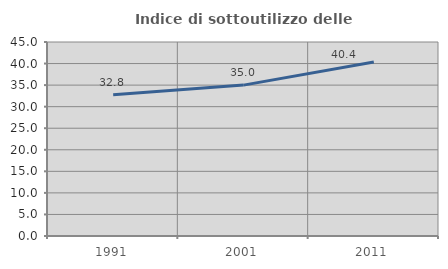
| Category | Indice di sottoutilizzo delle abitazioni  |
|---|---|
| 1991.0 | 32.766 |
| 2001.0 | 35 |
| 2011.0 | 40.381 |